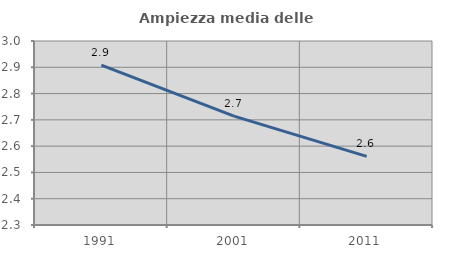
| Category | Ampiezza media delle famiglie |
|---|---|
| 1991.0 | 2.908 |
| 2001.0 | 2.714 |
| 2011.0 | 2.561 |